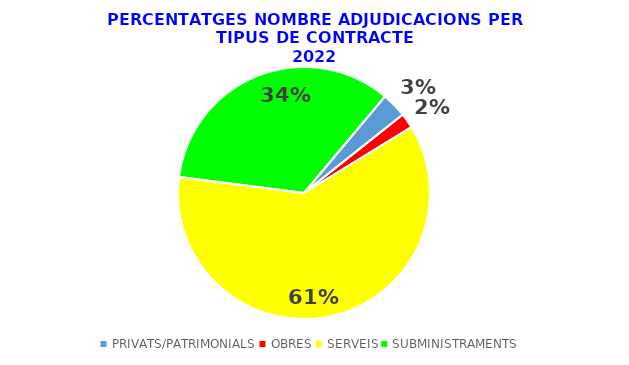
| Category | Series 0 |
|---|---|
| PRIVATS/PATRIMONIALS | 0.032 |
| OBRES | 0.019 |
| SERVEIS | 0.608 |
| SUBMINISTRAMENTS | 0.341 |